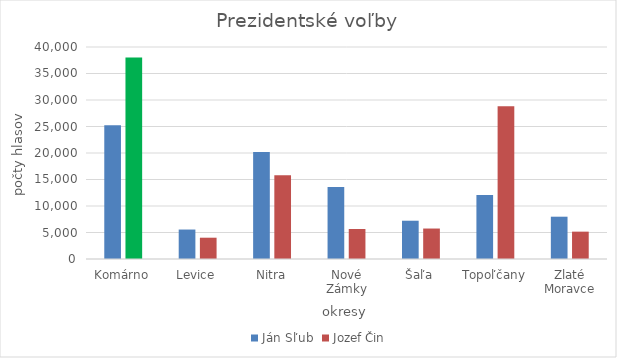
| Category | Ján Sľub | Jozef Čin |
|---|---|---|
| Komárno | 25234 | 38038 |
| Levice | 5559 | 4019 |
| Nitra | 20186 | 15802 |
| Nové Zámky | 13563 | 5659 |
| Šaľa | 7223 | 5749 |
| Topoľčany | 12077 | 28801 |
| Zlaté Moravce | 7981 | 5160 |